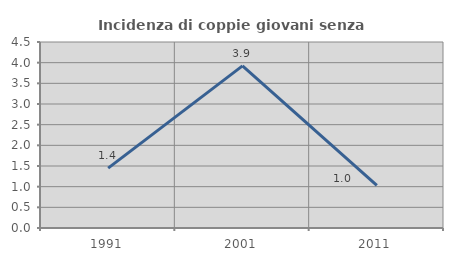
| Category | Incidenza di coppie giovani senza figli |
|---|---|
| 1991.0 | 1.449 |
| 2001.0 | 3.922 |
| 2011.0 | 1.031 |